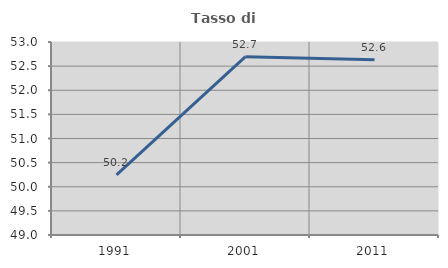
| Category | Tasso di occupazione   |
|---|---|
| 1991.0 | 50.248 |
| 2001.0 | 52.695 |
| 2011.0 | 52.632 |